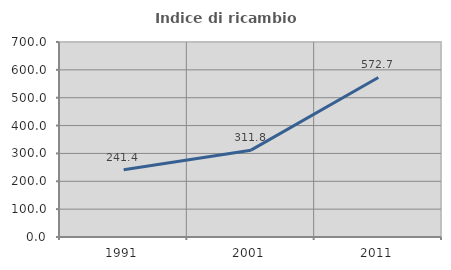
| Category | Indice di ricambio occupazionale  |
|---|---|
| 1991.0 | 241.379 |
| 2001.0 | 311.765 |
| 2011.0 | 572.727 |